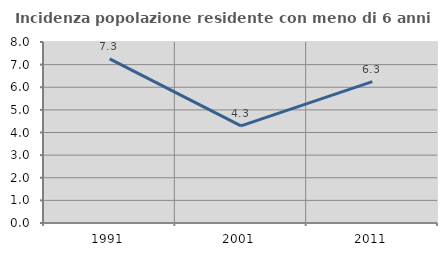
| Category | Incidenza popolazione residente con meno di 6 anni |
|---|---|
| 1991.0 | 7.254 |
| 2001.0 | 4.294 |
| 2011.0 | 6.25 |